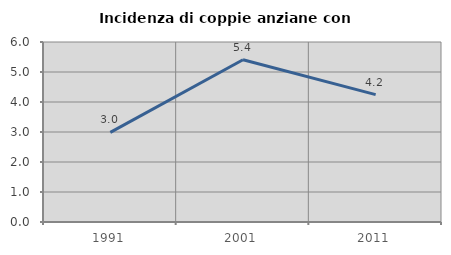
| Category | Incidenza di coppie anziane con figli |
|---|---|
| 1991.0 | 2.989 |
| 2001.0 | 5.41 |
| 2011.0 | 4.247 |